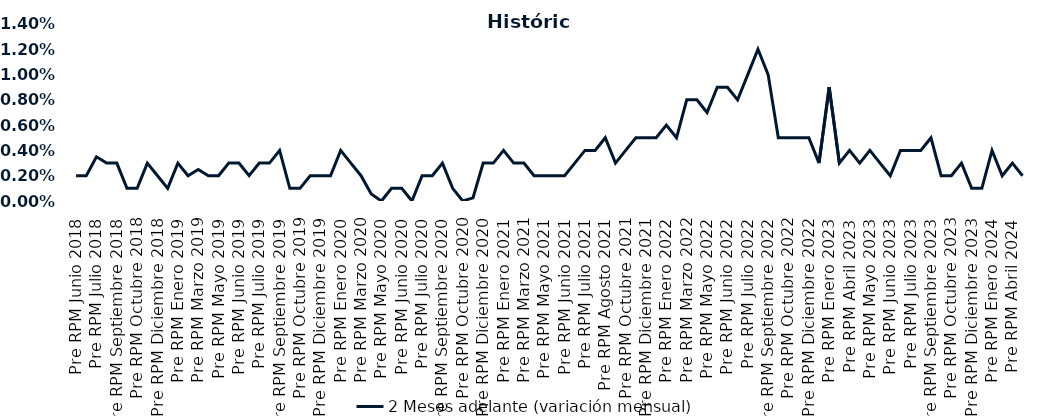
| Category | 2 Meses adelante (variación mensual) |
|---|---|
| Pre RPM Junio 2018 | 0.002 |
| Post RPM Junio 2018 | 0.002 |
| Pre RPM Julio 2018 | 0.004 |
| Post RPM Julio 2018 | 0.003 |
| Pre RPM Septiembre 2018 | 0.003 |
| Post RPM Septiembre 2018 | 0.001 |
| Pre RPM Octubre 2018 | 0.001 |
| Post RPM Octubre 2018 | 0.003 |
| Pre RPM Diciembre 2018 | 0.002 |
| Post RPM Diciembre 2018 | 0.001 |
| Pre RPM Enero 2019 | 0.003 |
| Post RPM Enero 2019 | 0.002 |
| Pre RPM Marzo 2019 | 0.002 |
| Post RPM Marzo 2019 | 0.002 |
| Pre RPM Mayo 2019 | 0.002 |
| Post RPM Mayo 2019 | 0.003 |
| Pre RPM Junio 2019 | 0.003 |
| Post RPM Junio 2019 | 0.002 |
| Pre RPM Julio 2019 | 0.003 |
| Post RPM Julio 2019 | 0.003 |
| Pre RPM Septiembre 2019 | 0.004 |
| Post RPM Septiembre 2019 | 0.001 |
| Pre RPM Octubre 2019 | 0.001 |
| Post RPM Octubre 2019 | 0.002 |
| Pre RPM Diciembre 2019 | 0.002 |
| Post RPM Diciembre 2019 | 0.002 |
| Pre RPM Enero 2020 | 0.004 |
| Post RPM Enero 2020 | 0.003 |
| Pre RPM Marzo 2020 | 0.002 |
| Post RPM Marzo 2020 | 0.001 |
| Pre RPM Mayo 2020 | 0 |
| Post RPM Mayo 2020 | 0.001 |
| Pre RPM Junio 2020 | 0.001 |
| Post RPM Junio 2020 | 0 |
| Pre RPM Julio 2020 | 0.002 |
| Post RPM Julio 2020 | 0.002 |
| Pre RPM Septiembre 2020 | 0.003 |
| Post RPM Septiembre 2020 | 0.001 |
| Pre RPM Octubre 2020 | 0 |
| Post RPM Octubre 2020 | 0 |
| Pre RPM Diciembre 2020 | 0.003 |
| Post RPM Diciembre 2020 | 0.003 |
| Pre RPM Enero 2021 | 0.004 |
| Post RPM Enero 2021 | 0.003 |
| Pre RPM Marzo 2021 | 0.003 |
| Post RPM Marzo 2021 | 0.002 |
| Pre RPM Mayo 2021 | 0.002 |
| Post RPM Mayo 2021 | 0.002 |
| Pre RPM Junio 2021 | 0.002 |
| Post RPM Junio 2021 | 0.003 |
| Pre RPM Julio 2021 | 0.004 |
| Post RPM Julio 2021 | 0.004 |
| Pre RPM Agosto 2021 | 0.005 |
| Post RPM Agosto 2021 | 0.003 |
| Pre RPM Octubre 2021 | 0.004 |
| Post RPM Octubre 2021 | 0.005 |
| Pre RPM Diciembre 2021 | 0.005 |
| Post RPM Diciembre 2021 | 0.005 |
| Pre RPM Enero 2022 | 0.006 |
| Post RPM Enero 2022 | 0.005 |
| Pre RPM Marzo 2022 | 0.008 |
| Post RPM Marzo 2022 | 0.008 |
| Pre RPM Mayo 2022 | 0.007 |
| Post RPM Mayo 2022 | 0.009 |
| Pre RPM Junio 2022 | 0.009 |
| Post RPM Junio 2022 | 0.008 |
| Pre RPM Julio 2022 | 0.01 |
| Post RPM Julio 2022 | 0.012 |
| Pre RPM Septiembre 2022 | 0.01 |
| Post RPM Septiembre 2022 | 0.005 |
| Pre RPM Octubre 2022 | 0.005 |
| Post RPM Octubre 2022 | 0.005 |
| Pre RPM Diciembre 2022 | 0.005 |
| Post RPM Diciembre 2022 | 0.003 |
| Pre RPM Enero 2023 | 0.009 |
| Post RPM Enero 2023 | 0.003 |
| Pre RPM Abril 2023 | 0.004 |
| Post RPM Abril 2023 | 0.003 |
| Pre RPM Mayo 2023 | 0.004 |
| Post RPM Mayo 2023 | 0.003 |
| Pre RPM Junio 2023 | 0.002 |
| Post RPM Junio 2023 | 0.004 |
| Pre RPM Julio 2023 | 0.004 |
| Post RPM Julio 2023 | 0.004 |
| Pre RPM Septiembre 2023 | 0.005 |
| Post RPM Septiembre 2023 | 0.002 |
| Pre RPM Octubre 2023 | 0.002 |
| Post RPM Octubre 2023 | 0.003 |
| Pre RPM Diciembre 2023 | 0.001 |
| Post RPM Diciembre 2023 | 0.001 |
| Pre RPM Enero 2024 | 0.004 |
| Post RPM Enero 2024 | 0.002 |
| Pre RPM Abril 2024 | 0.003 |
| Post RPM Abril 2024 | 0.002 |